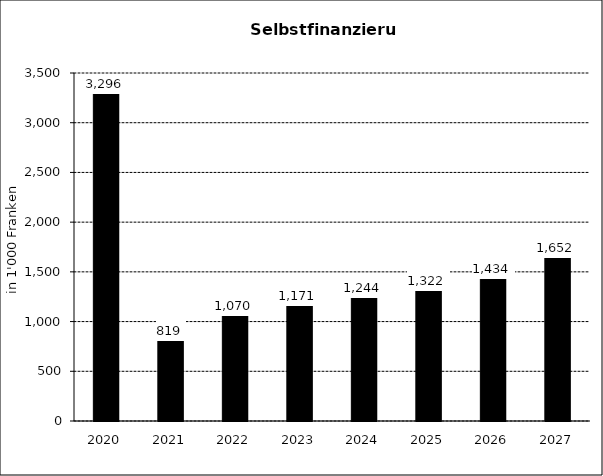
| Category | Selbstfinanzierung |
|---|---|
| 2020.0 | 3296 |
| 2021.0 | 819 |
| 2022.0 | 1070 |
| 2023.0 | 1171.362 |
| 2024.0 | 1243.627 |
| 2025.0 | 1321.884 |
| 2026.0 | 1434.18 |
| 2027.0 | 1652.271 |